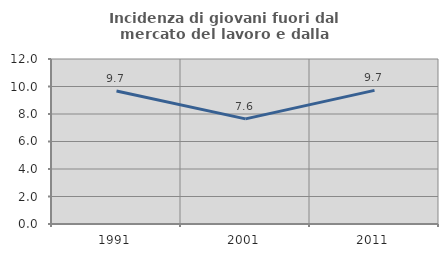
| Category | Incidenza di giovani fuori dal mercato del lavoro e dalla formazione  |
|---|---|
| 1991.0 | 9.677 |
| 2001.0 | 7.644 |
| 2011.0 | 9.72 |